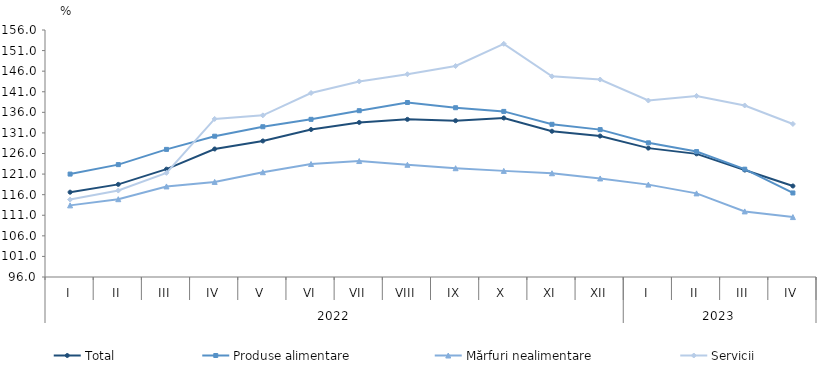
| Category | Total  | Produse alimentare | Mărfuri nealimentare  | Servicii |
|---|---|---|---|---|
| 0 | 116.6 | 121 | 113.4 | 114.8 |
| 1 | 118.5 | 123.3 | 114.9 | 117 |
| 2 | 122.2 | 127 | 118 | 121.3 |
| 3 | 127.1 | 130.2 | 119.1 | 134.4 |
| 4 | 129.047 | 132.5 | 121.45 | 135.267 |
| 5 | 131.827 | 134.301 | 123.443 | 140.701 |
| 6 | 133.547 | 136.399 | 124.168 | 143.511 |
| 7 | 134.294 | 138.387 | 123.256 | 145.253 |
| 8 | 133.971 | 137.121 | 122.424 | 147.248 |
| 9 | 134.625 | 136.226 | 121.779 | 152.646 |
| 10 | 131.406 | 133.093 | 121.201 | 144.742 |
| 11 | 130.241 | 131.801 | 119.936 | 143.965 |
| 12 | 127.307 | 128.59 | 118.441 | 138.865 |
| 13 | 125.91 | 126.47 | 116.31 | 139.99 |
| 14 | 121.977 | 122.19 | 111.932 | 137.666 |
| 15 | 118.102 | 116.414 | 110.554 | 133.178 |